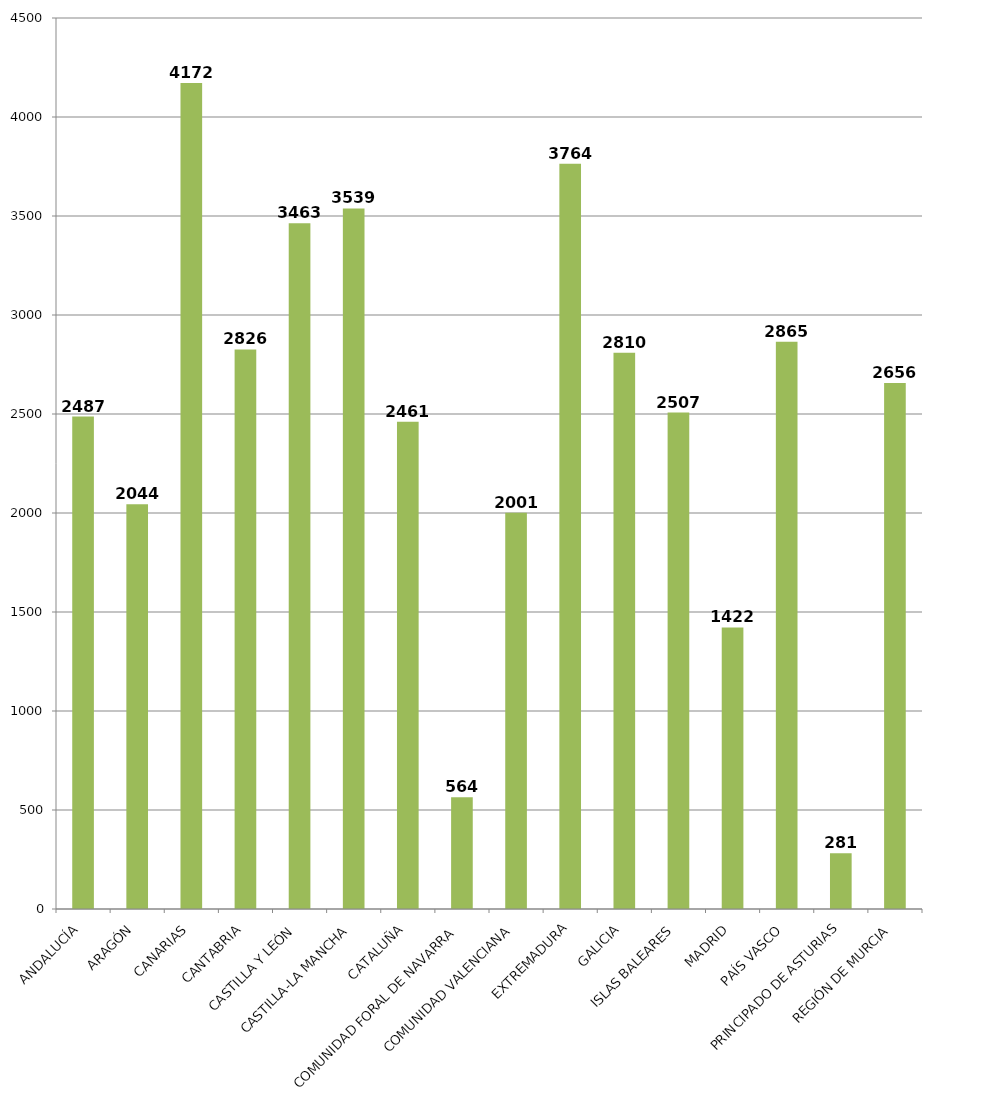
| Category | Total |
|---|---|
| ANDALUCÍA | 2486.75 |
| ARAGÓN | 2044 |
| CANARIAS | 4172.2 |
| CANTABRIA | 2826 |
| CASTILLA Y LEÓN | 3463.2 |
| CASTILLA-LA MANCHA | 3538.5 |
| CATALUÑA | 2461 |
| COMUNIDAD FORAL DE NAVARRA | 564 |
| COMUNIDAD VALENCIANA | 2001 |
| EXTREMADURA | 3764 |
| GALICIA | 2809.75 |
| ISLAS BALEARES | 2507 |
| MADRID | 1422.273 |
| PAÍS VASCO | 2864.8 |
| PRINCIPADO DE ASTURIAS | 281 |
| REGIÓN DE MURCIA | 2656 |